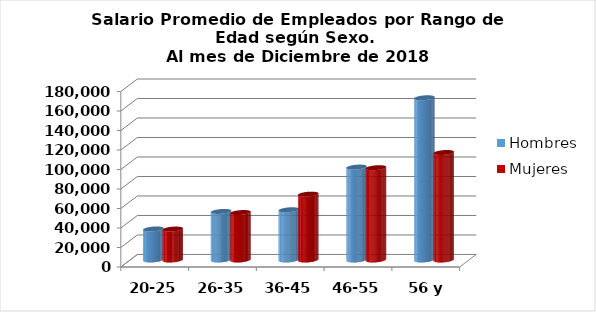
| Category | Hombres | Mujeres |
|---|---|---|
| 20-25 | 31837.273 | 31731.75 |
| 26-35 | 49831.288 | 48690.159 |
| 36-45 | 51530.333 | 67557.158 |
| 46-55 | 95289.911 | 94695.887 |
| 56 y más | 166430.62 | 110264.311 |